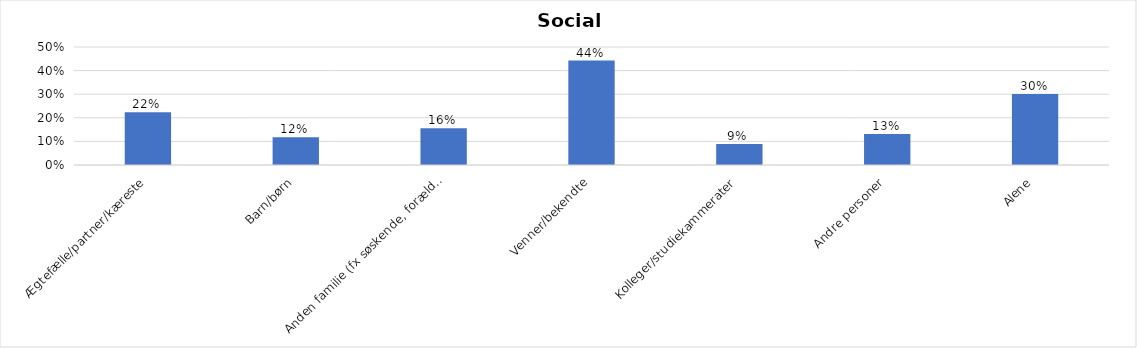
| Category | % |
|---|---|
| Ægtefælle/partner/kæreste | 0.224 |
| Barn/børn | 0.118 |
| Anden familie (fx søskende, forældre) | 0.155 |
| Venner/bekendte | 0.442 |
| Kolleger/studiekammerater | 0.089 |
| Andre personer | 0.132 |
| Alene | 0.301 |